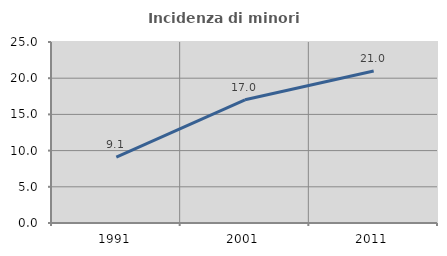
| Category | Incidenza di minori stranieri |
|---|---|
| 1991.0 | 9.091 |
| 2001.0 | 17.021 |
| 2011.0 | 21 |